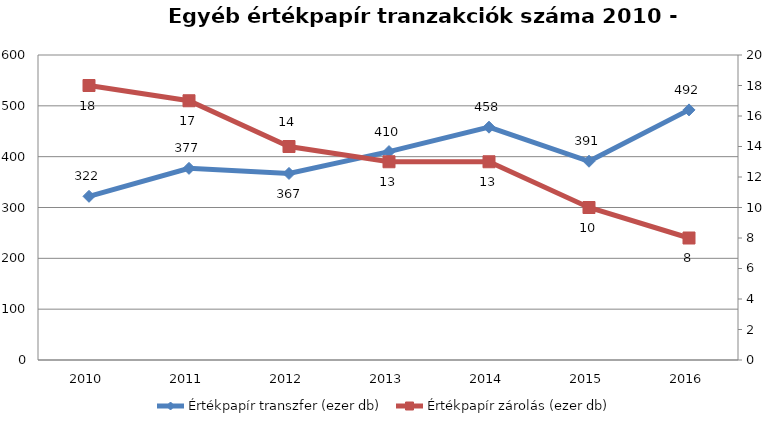
| Category | Értékpapír transzfer (ezer db) |
|---|---|
| 2010.0 | 322 |
| 2011.0 | 377 |
| 2012.0 | 367 |
| 2013.0 | 410 |
| 2014.0 | 458 |
| 2015.0 | 391 |
| 2016.0 | 492 |